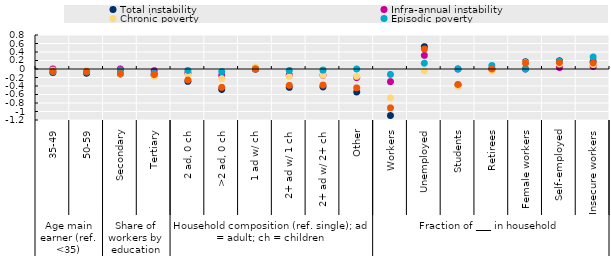
| Category | Total instability | Infra-annual instability | Chronic poverty | Episodic poverty | Volatility and downward mobility |
|---|---|---|---|---|---|
| 0 | -0.081 | 0 | -0.027 | -0.059 | -0.058 |
| 1 | -0.099 | -0.056 | -0.035 | -0.073 | -0.061 |
| 2 | -0.119 | 0 | -0.114 | -0.027 | -0.106 |
| 3 | -0.145 | -0.039 | -0.177 | -0.096 | -0.132 |
| 4 | -0.291 | -0.098 | -0.14 | -0.035 | -0.26 |
| 5 | -0.483 | -0.149 | -0.226 | -0.062 | -0.433 |
| 6 | 0 | 0 | 0.046 | 0 | 0 |
| 7 | -0.432 | -0.137 | -0.179 | -0.034 | -0.385 |
| 8 | -0.423 | -0.143 | -0.143 | -0.025 | -0.379 |
| 9 | -0.542 | -0.202 | -0.174 | 0 | -0.444 |
| 10 | -1.095 | -0.298 | -0.678 | -0.128 | -0.915 |
| 11 | 0.525 | 0.32 | -0.045 | 0.135 | 0.469 |
| 12 | -0.375 | 0 | -0.41 | 0 | -0.365 |
| 13 | 0 | 0 | -0.046 | 0.082 | 0 |
| 14 | 0.17 | 0 | 0.149 | 0 | 0.139 |
| 15 | 0.193 | 0.034 | 0.118 | 0.182 | 0.153 |
| 16 | 0.174 | 0.059 | 0.104 | 0.283 | 0.142 |